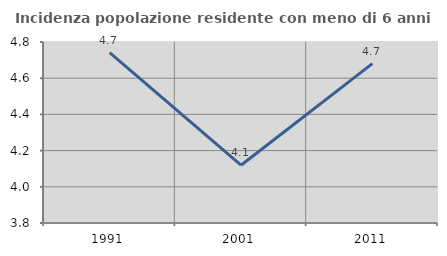
| Category | Incidenza popolazione residente con meno di 6 anni |
|---|---|
| 1991.0 | 4.741 |
| 2001.0 | 4.119 |
| 2011.0 | 4.68 |